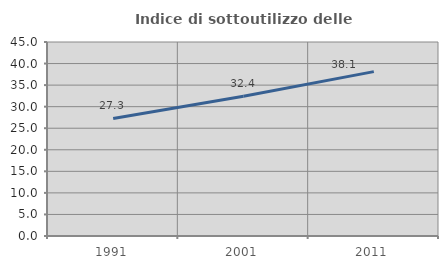
| Category | Indice di sottoutilizzo delle abitazioni  |
|---|---|
| 1991.0 | 27.273 |
| 2001.0 | 32.411 |
| 2011.0 | 38.124 |